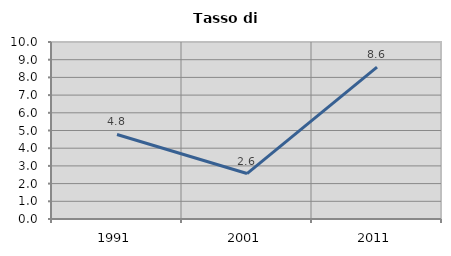
| Category | Tasso di disoccupazione   |
|---|---|
| 1991.0 | 4.776 |
| 2001.0 | 2.568 |
| 2011.0 | 8.577 |